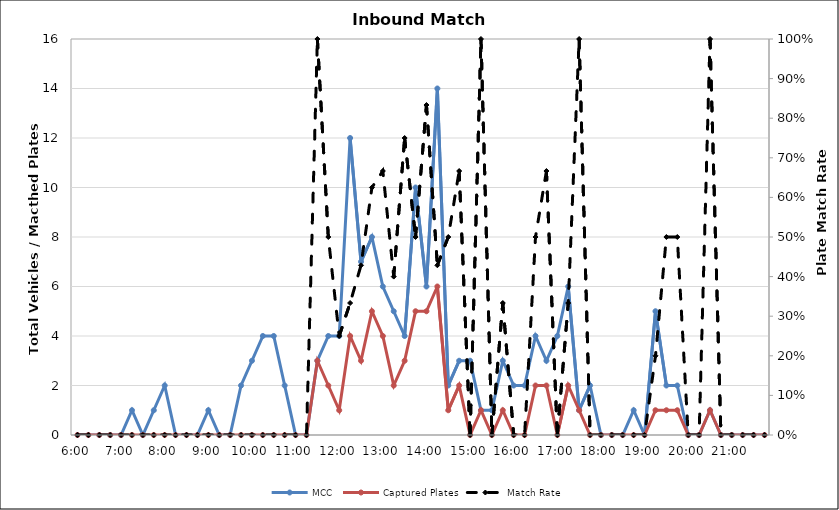
| Category | MCC | Captured Plates |
|---|---|---|
| 0.25 | 0 | 0 |
| 0.260416666666667 | 0 | 0 |
| 0.270833333333333 | 0 | 0 |
| 0.28125 | 0 | 0 |
| 0.291666666666667 | 0 | 0 |
| 0.302083333333333 | 1 | 0 |
| 0.3125 | 0 | 0 |
| 0.322916666666667 | 1 | 0 |
| 0.333333333333333 | 2 | 0 |
| 0.34375 | 0 | 0 |
| 0.354166666666667 | 0 | 0 |
| 0.364583333333333 | 0 | 0 |
| 0.375 | 1 | 0 |
| 0.385416666666667 | 0 | 0 |
| 0.395833333333333 | 0 | 0 |
| 0.40625 | 2 | 0 |
| 0.416666666666667 | 3 | 0 |
| 0.427083333333333 | 4 | 0 |
| 0.4375 | 4 | 0 |
| 0.447916666666667 | 2 | 0 |
| 0.458333333333333 | 0 | 0 |
| 0.46875 | 0 | 0 |
| 0.479166666666667 | 3 | 3 |
| 0.489583333333333 | 4 | 2 |
| 0.5 | 4 | 1 |
| 0.510416666666667 | 12 | 4 |
| 0.520833333333333 | 7 | 3 |
| 0.53125 | 8 | 5 |
| 0.541666666666667 | 6 | 4 |
| 0.552083333333333 | 5 | 2 |
| 0.5625 | 4 | 3 |
| 0.572916666666667 | 10 | 5 |
| 0.583333333333333 | 6 | 5 |
| 0.59375 | 14 | 6 |
| 0.604166666666667 | 2 | 1 |
| 0.614583333333333 | 3 | 2 |
| 0.625 | 3 | 0 |
| 0.635416666666667 | 1 | 1 |
| 0.645833333333333 | 1 | 0 |
| 0.65625 | 3 | 1 |
| 0.666666666666667 | 2 | 0 |
| 0.677083333333333 | 2 | 0 |
| 0.6875 | 4 | 2 |
| 0.697916666666667 | 3 | 2 |
| 0.708333333333333 | 4 | 0 |
| 0.71875 | 6 | 2 |
| 0.729166666666667 | 1 | 1 |
| 0.739583333333333 | 2 | 0 |
| 0.75 | 0 | 0 |
| 0.760416666666667 | 0 | 0 |
| 0.770833333333333 | 0 | 0 |
| 0.78125 | 1 | 0 |
| 0.791666666666667 | 0 | 0 |
| 0.802083333333333 | 5 | 1 |
| 0.8125 | 2 | 1 |
| 0.822916666666667 | 2 | 1 |
| 0.833333333333333 | 0 | 0 |
| 0.84375 | 0 | 0 |
| 0.854166666666667 | 1 | 1 |
| 0.864583333333333 | 0 | 0 |
| 0.875 | 0 | 0 |
| 0.885416666666667 | 0 | 0 |
| 0.895833333333333 | 0 | 0 |
| 0.90625 | 0 | 0 |